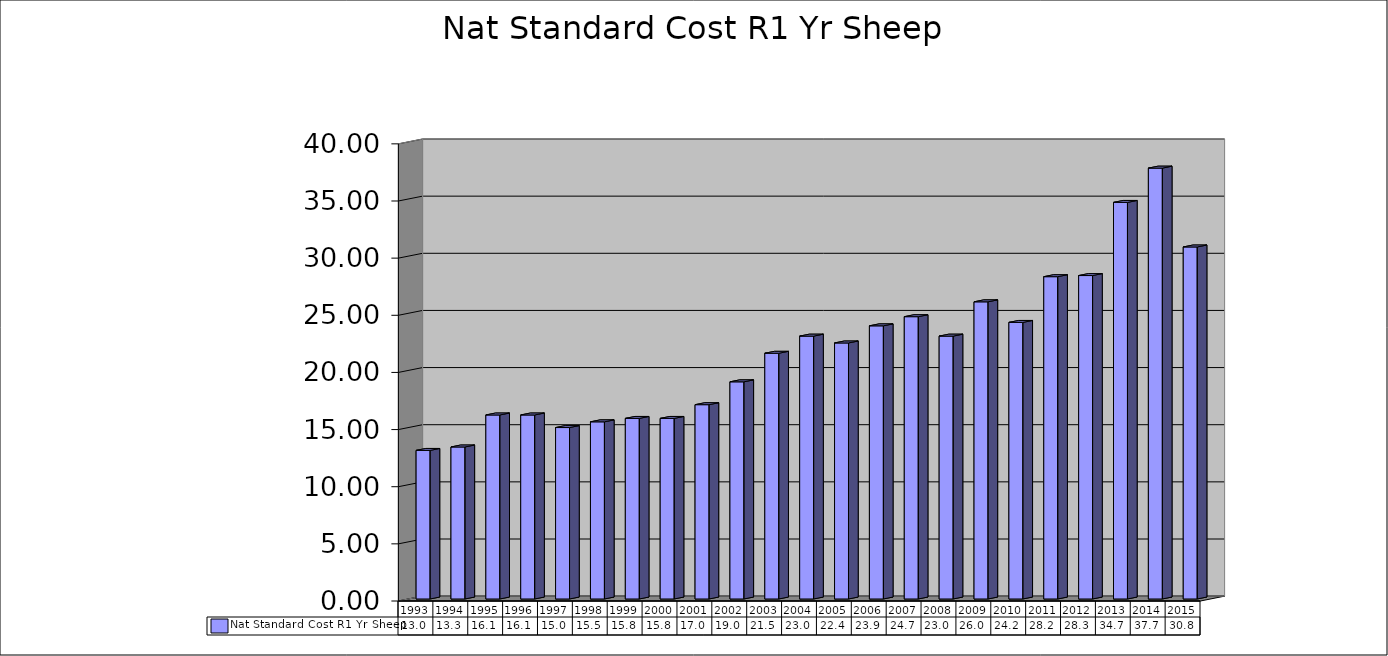
| Category | Nat Standard Cost R1 Yr Sheep |
|---|---|
| 1993.0 | 13 |
| 1994.0 | 13.3 |
| 1995.0 | 16.1 |
| 1996.0 | 16.1 |
| 1997.0 | 15 |
| 1998.0 | 15.5 |
| 1999.0 | 15.8 |
| 2000.0 | 15.8 |
| 2001.0 | 17 |
| 2002.0 | 19 |
| 2003.0 | 21.5 |
| 2004.0 | 23 |
| 2005.0 | 22.4 |
| 2006.0 | 23.9 |
| 2007.0 | 24.7 |
| 2008.0 | 23 |
| 2009.0 | 26 |
| 2010.0 | 24.2 |
| 2011.0 | 28.2 |
| 2012.0 | 28.3 |
| 2013.0 | 34.7 |
| 2014.0 | 37.7 |
| 2015.0 | 30.8 |